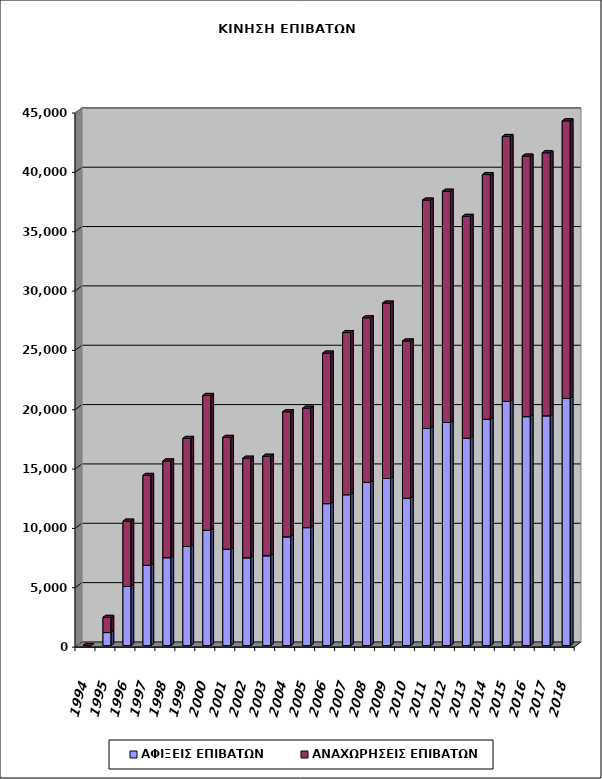
| Category | ΑΦΙΞΕΙΣ ΕΠΙΒΑΤΩΝ | ΑΝΑΧΩΡΗΣΕΙΣ ΕΠΙΒΑΤΩΝ |
|---|---|---|
| 1994.0 | 0 | 0 |
| 1995.0 | 1100 | 1279 |
| 1996.0 | 4988 | 5495 |
| 1997.0 | 6761 | 7576 |
| 1998.0 | 7408 | 8150 |
| 1999.0 | 8348 | 9105 |
| 2000.0 | 9716 | 11359 |
| 2001.0 | 8121 | 9419 |
| 2002.0 | 7400 | 8387 |
| 2003.0 | 7571 | 8381 |
| 2004.0 | 9164 | 10534 |
| 2005.0 | 9939 | 10065 |
| 2006.0 | 11961 | 12681 |
| 2007.0 | 12714 | 13658 |
| 2008.0 | 13764 | 13849 |
| 2009.0 | 14084 | 14771 |
| 2010.0 | 12419 | 13245 |
| 2011.0 | 18291 | 19243 |
| 2012.0 | 18799 | 19483 |
| 2013.0 | 17477 | 18685 |
| 2014.0 | 19074 | 20612 |
| 2015.0 | 20584 | 22308 |
| 2016.0 | 19292 | 21947 |
| 2017.0 | 19361 | 22160 |
| 2018.0 | 20829 | 23380 |